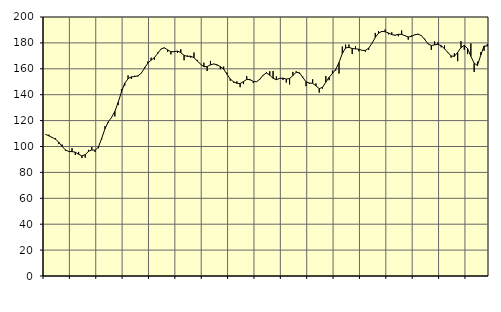
| Category | Piggar | Series 1 |
|---|---|---|
| nan | 109.1 | 109.36 |
| 87.0 | 109.1 | 108.2 |
| 87.0 | 106.6 | 106.95 |
| 87.0 | 106.4 | 105.59 |
| nan | 101.9 | 103.23 |
| 88.0 | 101.5 | 100 |
| 88.0 | 96.8 | 97.39 |
| 88.0 | 96 | 96.13 |
| nan | 98.8 | 96.05 |
| 89.0 | 93.4 | 95.6 |
| 89.0 | 95.8 | 94 |
| 89.0 | 91.1 | 92.74 |
| nan | 91.4 | 93.73 |
| 90.0 | 97.4 | 96.26 |
| 90.0 | 99.6 | 97.35 |
| 90.0 | 95.8 | 97.05 |
| nan | 98.7 | 99.54 |
| 91.0 | 105.5 | 106.22 |
| 91.0 | 115.7 | 113.7 |
| 91.0 | 118.4 | 119.02 |
| nan | 122.8 | 122.49 |
| 92.0 | 123.2 | 127.15 |
| 92.0 | 132 | 134.08 |
| 92.0 | 144.3 | 142.15 |
| nan | 147 | 148.83 |
| 93.0 | 154.9 | 152.35 |
| 93.0 | 152.2 | 153.77 |
| 93.0 | 154.6 | 154.04 |
| nan | 154.1 | 154.56 |
| 94.0 | 156.5 | 156.63 |
| 94.0 | 161.2 | 160.48 |
| 94.0 | 165.6 | 164.4 |
| nan | 168.6 | 166.68 |
| 95.0 | 166.9 | 168.72 |
| 95.0 | 172.6 | 171.88 |
| 95.0 | 175.2 | 175.32 |
| nan | 175.9 | 176.26 |
| 96.0 | 173.1 | 174.65 |
| 96.0 | 171.1 | 173.14 |
| 96.0 | 173.6 | 173.24 |
| nan | 172.2 | 173.7 |
| 97.0 | 175.1 | 172.51 |
| 97.0 | 166.6 | 170.37 |
| 97.0 | 170.3 | 169.58 |
| nan | 168.6 | 169.73 |
| 98.0 | 172.6 | 168.59 |
| 98.0 | 166.9 | 166.14 |
| 98.0 | 163.7 | 163.56 |
| nan | 164.7 | 161.59 |
| 99.0 | 158.3 | 161.73 |
| 99.0 | 166.1 | 163.03 |
| 99.0 | 163.6 | 163.77 |
| nan | 162.6 | 163.07 |
| 0.0 | 159.7 | 161.71 |
| 0.0 | 161.7 | 159.82 |
| 0.0 | 157 | 155.83 |
| nan | 150.8 | 152.11 |
| 1.0 | 149.3 | 150.02 |
| 1.0 | 150.3 | 148.8 |
| 1.0 | 145.8 | 148.66 |
| nan | 148.2 | 150.12 |
| 2.0 | 154.3 | 151.82 |
| 2.0 | 151.2 | 151.65 |
| 2.0 | 149 | 150.24 |
| nan | 150.1 | 150.01 |
| 3.0 | 152.2 | 151.98 |
| 3.0 | 155 | 155.21 |
| 3.0 | 157.4 | 156.74 |
| nan | 158.1 | 155.14 |
| 4.0 | 158.3 | 152.58 |
| 4.0 | 154.1 | 151.64 |
| 4.0 | 152.8 | 152.55 |
| nan | 151.4 | 152.81 |
| 5.0 | 149.4 | 152.07 |
| 5.0 | 147.9 | 152.5 |
| 5.0 | 157.6 | 154.77 |
| nan | 158.1 | 157.28 |
| 6.0 | 156.2 | 156.93 |
| 6.0 | 153.9 | 153.37 |
| 6.0 | 146.6 | 149.91 |
| nan | 148.5 | 149.02 |
| 7.0 | 151.9 | 148.78 |
| 7.0 | 148.7 | 146.77 |
| 7.0 | 141.6 | 144.7 |
| nan | 144.7 | 145.69 |
| 8.0 | 154.4 | 149.66 |
| 8.0 | 151.2 | 153.49 |
| 8.0 | 158.5 | 156.39 |
| nan | 158.6 | 159.51 |
| 9.0 | 156.3 | 164.88 |
| 9.0 | 177.2 | 171.81 |
| 9.0 | 178.7 | 176.12 |
| nan | 178.7 | 176.51 |
| 10.0 | 171.4 | 175.66 |
| 10.0 | 177.5 | 175.38 |
| 10.0 | 173.6 | 175.16 |
| nan | 174.2 | 174.24 |
| 11.0 | 173.2 | 174.18 |
| 11.0 | 174.7 | 175.94 |
| 11.0 | 179.5 | 179.66 |
| nan | 187.7 | 184.21 |
| 12.0 | 189.1 | 187.51 |
| 12.0 | 188.4 | 188.88 |
| 12.0 | 190.4 | 188.64 |
| nan | 186.6 | 187.69 |
| 13.0 | 188.2 | 186.37 |
| 13.0 | 185.6 | 185.97 |
| 13.0 | 185.1 | 186.58 |
| nan | 189.6 | 186.59 |
| 14.0 | 185.8 | 185.56 |
| 14.0 | 182.5 | 184.61 |
| 14.0 | 185.7 | 185.03 |
| nan | 186.1 | 186.29 |
| 15.0 | 187 | 186.73 |
| 15.0 | 185.4 | 185.58 |
| 15.0 | 183.2 | 182.65 |
| nan | 179.4 | 179.21 |
| 16.0 | 174.6 | 178 |
| 16.0 | 181.1 | 178.47 |
| 16.0 | 180.4 | 178.89 |
| nan | 176.6 | 177.87 |
| 17.0 | 178 | 175.49 |
| 17.0 | 172.3 | 172.68 |
| 17.0 | 168.6 | 169.91 |
| nan | 172 | 169.63 |
| 18.0 | 165.9 | 172.76 |
| 18.0 | 181.3 | 176.35 |
| 18.0 | 174.7 | 178.12 |
| nan | 171.4 | 175.69 |
| 19.0 | 179.6 | 169.66 |
| 19.0 | 157.5 | 164.33 |
| 19.0 | 165.5 | 162.53 |
| nan | 172.8 | 170.56 |
| 20.0 | 173.9 | 177.61 |
| 20.0 | 179.2 | 177.56 |